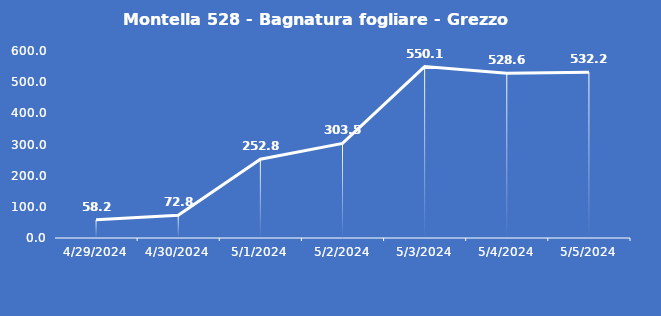
| Category | Montella 528 - Bagnatura fogliare - Grezzo (min) |
|---|---|
| 4/29/24 | 58.2 |
| 4/30/24 | 72.8 |
| 5/1/24 | 252.8 |
| 5/2/24 | 303.5 |
| 5/3/24 | 550.1 |
| 5/4/24 | 528.6 |
| 5/5/24 | 532.2 |